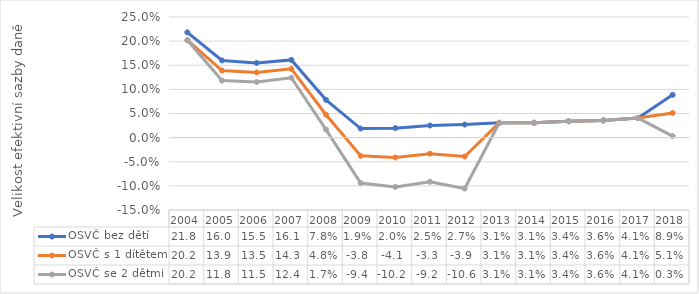
| Category | OSVČ bez dětí | OSVČ s 1 dítětem | OSVČ se 2 dětmi |
|---|---|---|---|
| 2004.0 | 0.218 | 0.202 | 0.202 |
| 2005.0 | 0.16 | 0.139 | 0.118 |
| 2006.0 | 0.155 | 0.135 | 0.115 |
| 2007.0 | 0.161 | 0.143 | 0.124 |
| 2008.0 | 0.078 | 0.048 | 0.017 |
| 2009.0 | 0.019 | -0.038 | -0.094 |
| 2010.0 | 0.02 | -0.041 | -0.102 |
| 2011.0 | 0.025 | -0.033 | -0.092 |
| 2012.0 | 0.027 | -0.039 | -0.106 |
| 2013.0 | 0.031 | 0.031 | 0.031 |
| 2014.0 | 0.031 | 0.031 | 0.031 |
| 2015.0 | 0.034 | 0.034 | 0.034 |
| 2016.0 | 0.036 | 0.036 | 0.036 |
| 2017.0 | 0.041 | 0.041 | 0.041 |
| 2018.0 | 0.089 | 0.051 | 0.003 |